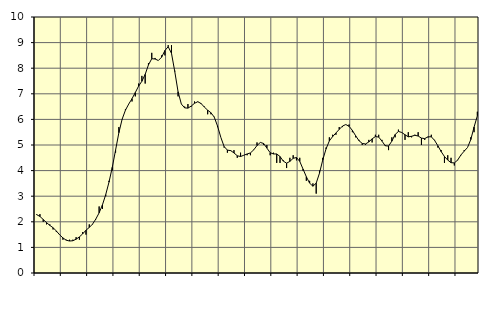
| Category | Piggar | Series 1 |
|---|---|---|
| nan | 2.3 | 2.28 |
| 87.0 | 2.3 | 2.21 |
| 87.0 | 2 | 2.09 |
| 87.0 | 1.9 | 1.97 |
| nan | 1.9 | 1.86 |
| 88.0 | 1.7 | 1.77 |
| 88.0 | 1.6 | 1.64 |
| 88.0 | 1.5 | 1.49 |
| nan | 1.3 | 1.37 |
| 89.0 | 1.3 | 1.28 |
| 89.0 | 1.3 | 1.25 |
| 89.0 | 1.3 | 1.26 |
| nan | 1.4 | 1.32 |
| 90.0 | 1.3 | 1.41 |
| 90.0 | 1.6 | 1.53 |
| 90.0 | 1.5 | 1.67 |
| nan | 1.9 | 1.78 |
| 91.0 | 1.9 | 1.91 |
| 91.0 | 2.1 | 2.11 |
| 91.0 | 2.6 | 2.35 |
| nan | 2.5 | 2.66 |
| 92.0 | 3 | 3.06 |
| 92.0 | 3.6 | 3.55 |
| 92.0 | 4 | 4.13 |
| nan | 4.7 | 4.8 |
| 93.0 | 5.7 | 5.48 |
| 93.0 | 6 | 6.01 |
| 93.0 | 6.4 | 6.36 |
| nan | 6.6 | 6.6 |
| 94.0 | 6.7 | 6.81 |
| 94.0 | 6.9 | 7.05 |
| 94.0 | 7.4 | 7.3 |
| nan | 7.7 | 7.49 |
| 95.0 | 7.4 | 7.76 |
| 95.0 | 8.2 | 8.13 |
| 95.0 | 8.6 | 8.37 |
| nan | 8.4 | 8.36 |
| 96.0 | 8.3 | 8.3 |
| 96.0 | 8.5 | 8.43 |
| 96.0 | 8.5 | 8.69 |
| nan | 8.9 | 8.84 |
| 97.0 | 8.9 | 8.58 |
| 97.0 | 7.9 | 7.87 |
| 97.0 | 6.9 | 7.08 |
| nan | 6.6 | 6.6 |
| 98.0 | 6.5 | 6.45 |
| 98.0 | 6.6 | 6.44 |
| 98.0 | 6.5 | 6.52 |
| nan | 6.7 | 6.63 |
| 99.0 | 6.7 | 6.69 |
| 99.0 | 6.6 | 6.62 |
| 99.0 | 6.5 | 6.48 |
| nan | 6.2 | 6.36 |
| 0.0 | 6.2 | 6.26 |
| 0.0 | 6.1 | 6.09 |
| 0.0 | 5.7 | 5.74 |
| nan | 5.3 | 5.3 |
| 1.0 | 4.9 | 4.94 |
| 1.0 | 4.7 | 4.8 |
| 1.0 | 4.8 | 4.78 |
| nan | 4.8 | 4.69 |
| 2.0 | 4.5 | 4.58 |
| 2.0 | 4.7 | 4.55 |
| 2.0 | 4.6 | 4.6 |
| nan | 4.6 | 4.65 |
| 3.0 | 4.6 | 4.69 |
| 3.0 | 4.8 | 4.81 |
| 3.0 | 5.1 | 4.98 |
| nan | 5.1 | 5.1 |
| 4.0 | 5 | 5.06 |
| 4.0 | 5 | 4.88 |
| 4.0 | 4.6 | 4.7 |
| nan | 4.7 | 4.65 |
| 5.0 | 4.3 | 4.65 |
| 5.0 | 4.3 | 4.55 |
| 5.0 | 4.4 | 4.37 |
| nan | 4.1 | 4.29 |
| 6.0 | 4.5 | 4.36 |
| 6.0 | 4.6 | 4.48 |
| 6.0 | 4.4 | 4.51 |
| nan | 4.5 | 4.36 |
| 7.0 | 4 | 4.06 |
| 7.0 | 3.6 | 3.76 |
| 7.0 | 3.6 | 3.51 |
| nan | 3.5 | 3.39 |
| 8.0 | 3.1 | 3.51 |
| 8.0 | 4 | 3.9 |
| 8.0 | 4.5 | 4.42 |
| nan | 4.9 | 4.85 |
| 9.0 | 5.3 | 5.16 |
| 9.0 | 5.4 | 5.33 |
| 9.0 | 5.4 | 5.47 |
| nan | 5.7 | 5.61 |
| 10.0 | 5.7 | 5.74 |
| 10.0 | 5.8 | 5.8 |
| 10.0 | 5.8 | 5.73 |
| nan | 5.5 | 5.57 |
| 11.0 | 5.3 | 5.36 |
| 11.0 | 5.2 | 5.17 |
| 11.0 | 5 | 5.06 |
| nan | 5 | 5.04 |
| 12.0 | 5.2 | 5.12 |
| 12.0 | 5.1 | 5.24 |
| 12.0 | 5.4 | 5.33 |
| nan | 5.4 | 5.31 |
| 13.0 | 5.2 | 5.15 |
| 13.0 | 5 | 4.97 |
| 13.0 | 4.8 | 4.96 |
| nan | 5.3 | 5.15 |
| 14.0 | 5.3 | 5.41 |
| 14.0 | 5.6 | 5.53 |
| 14.0 | 5.5 | 5.49 |
| nan | 5.2 | 5.4 |
| 15.0 | 5.5 | 5.32 |
| 15.0 | 5.3 | 5.34 |
| 15.0 | 5.4 | 5.38 |
| nan | 5.5 | 5.35 |
| 16.0 | 5 | 5.27 |
| 16.0 | 5.2 | 5.25 |
| 16.0 | 5.3 | 5.32 |
| nan | 5.4 | 5.32 |
| 17.0 | 5.2 | 5.18 |
| 17.0 | 4.9 | 4.97 |
| 17.0 | 4.8 | 4.74 |
| nan | 4.3 | 4.55 |
| 18.0 | 4.6 | 4.41 |
| 18.0 | 4.5 | 4.31 |
| 18.0 | 4.2 | 4.3 |
| nan | 4.4 | 4.41 |
| 19.0 | 4.6 | 4.61 |
| 19.0 | 4.8 | 4.76 |
| 19.0 | 4.9 | 4.9 |
| nan | 5.3 | 5.21 |
| 20.0 | 5.5 | 5.7 |
| 20.0 | 6.3 | 6.14 |